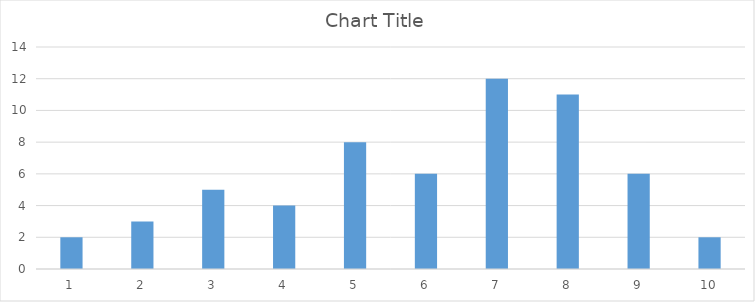
| Category | Series 0 |
|---|---|
| 0 | 2 |
| 1 | 3 |
| 2 | 5 |
| 3 | 4 |
| 4 | 8 |
| 5 | 6 |
| 6 | 12 |
| 7 | 11 |
| 8 | 6 |
| 9 | 2 |